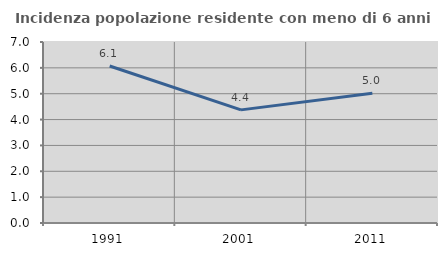
| Category | Incidenza popolazione residente con meno di 6 anni |
|---|---|
| 1991.0 | 6.07 |
| 2001.0 | 4.375 |
| 2011.0 | 5.019 |